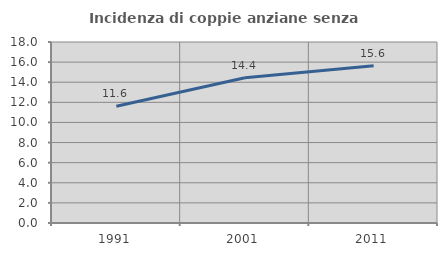
| Category | Incidenza di coppie anziane senza figli  |
|---|---|
| 1991.0 | 11.618 |
| 2001.0 | 14.439 |
| 2011.0 | 15.63 |